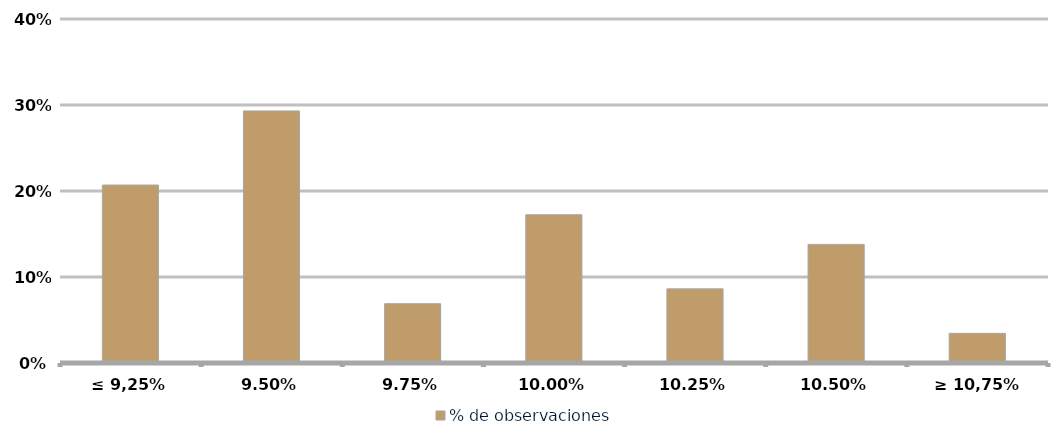
| Category | % de observaciones  |
|---|---|
| ≤ 9,25% | 0.207 |
| 9,50% | 0.293 |
| 9,75% | 0.069 |
| 10,00% | 0.172 |
| 10,25% | 0.086 |
| 10,50% | 0.138 |
| ≥ 10,75% | 0.034 |